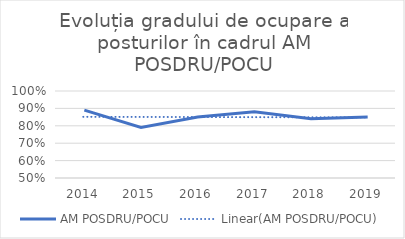
| Category | AM POSDRU/POCU |
|---|---|
| 2014.0 | 0.89 |
| 2015.0 | 0.79 |
| 2016.0 | 0.85 |
| 2017.0 | 0.88 |
| 2018.0 | 0.84 |
| 2019.0 | 0.85 |